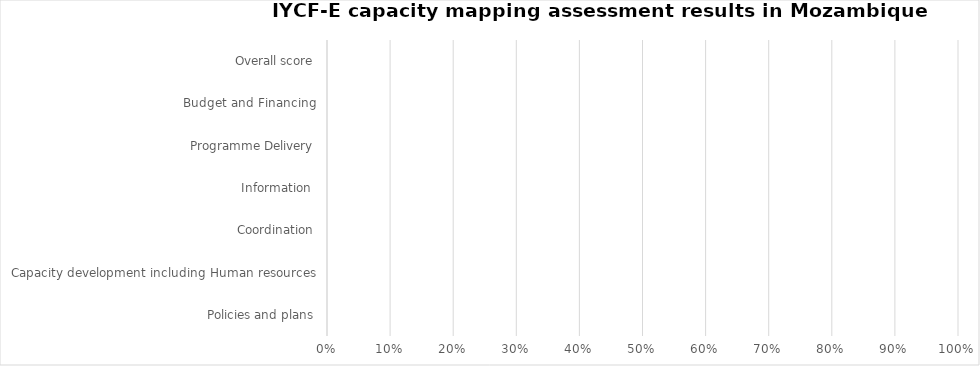
| Category | Percent  |
|---|---|
| Policies and plans | 0 |
| Capacity development including Human resources | 0 |
| Coordination | 0 |
| Information  | 0 |
| Programme Delivery | 0 |
| Budget and Financing | 0 |
| Overall score | 0 |